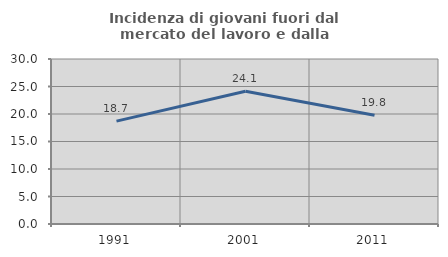
| Category | Incidenza di giovani fuori dal mercato del lavoro e dalla formazione  |
|---|---|
| 1991.0 | 18.703 |
| 2001.0 | 24.138 |
| 2011.0 | 19.764 |